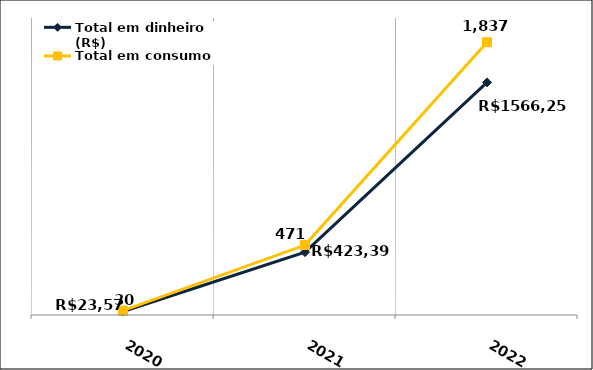
| Category | Total em dinheiro (R$) |
|---|---|
| 2020.0 | 23.57 |
| 2021.0 | 423.39 |
| 2022.0 | 1566.25 |